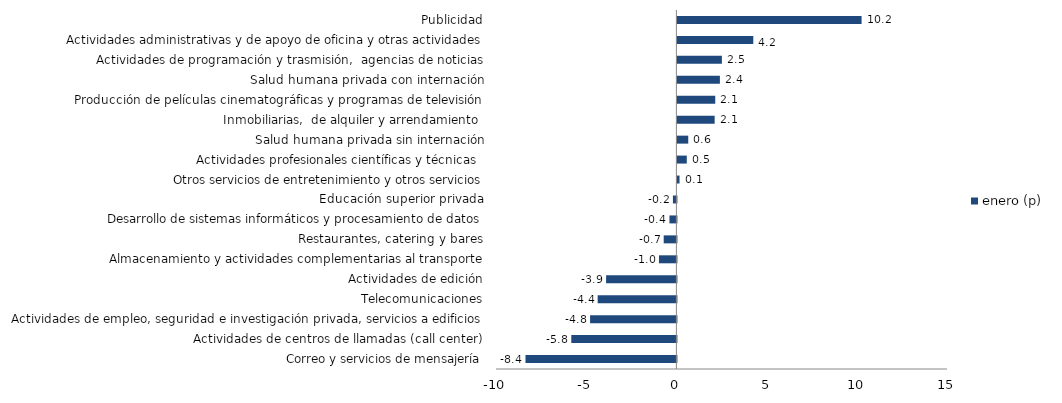
| Category | enero (p) |
|---|---|
| Correo y servicios de mensajería | -8.366 |
| Actividades de centros de llamadas (call center) | -5.826 |
| Actividades de empleo, seguridad e investigación privada, servicios a edificios | -4.785 |
| Telecomunicaciones | -4.365 |
| Actividades de edición | -3.897 |
| Almacenamiento y actividades complementarias al transporte | -0.966 |
| Restaurantes, catering y bares | -0.704 |
| Desarrollo de sistemas informáticos y procesamiento de datos | -0.386 |
| Educación superior privada | -0.193 |
| Otros servicios de entretenimiento y otros servicios | 0.118 |
| Actividades profesionales científicas y técnicas  | 0.521 |
| Salud humana privada sin internación | 0.601 |
| Inmobiliarias,  de alquiler y arrendamiento  | 2.066 |
| Producción de películas cinematográficas y programas de televisión | 2.098 |
| Salud humana privada con internación | 2.356 |
| Actividades de programación y trasmisión,  agencias de noticias | 2.466 |
| Actividades administrativas y de apoyo de oficina y otras actividades | 4.208 |
| Publicidad | 10.209 |